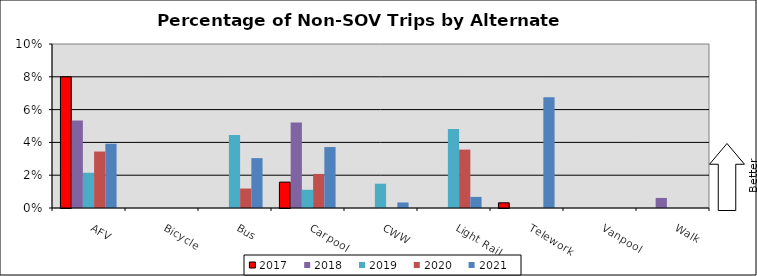
| Category | 2017 | 2018 | 2019 | 2020 | 2021 |
|---|---|---|---|---|---|
| AFV | 0.08 | 0.053 | 0.021 | 0.034 | 0.039 |
| Bicycle | 0 | 0 | 0 | 0 | 0 |
| Bus | 0 | 0 | 0.044 | 0.012 | 0.03 |
| Carpool | 0.016 | 0.052 | 0.011 | 0.021 | 0.037 |
| CWW | 0 | 0 | 0.015 | 0 | 0.003 |
| Light Rail | 0 | 0 | 0.048 | 0.036 | 0.007 |
| Telework | 0.003 | 0 | 0 | 0 | 0.068 |
| Vanpool | 0 | 0 | 0 | 0 | 0 |
| Walk | 0 | 0.006 | 0 | 0 | 0 |